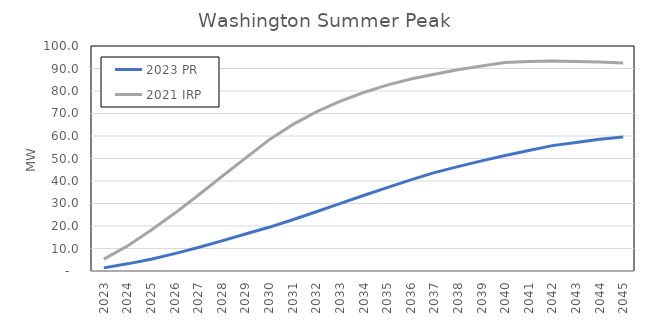
| Category | 2023 PR | 2021 IRP |
|---|---|---|
| 2023.0 | 1.398 | 5.265 |
| 2024.0 | 3.178 | 11.132 |
| 2025.0 | 5.244 | 18.14 |
| 2026.0 | 7.74 | 25.625 |
| 2027.0 | 10.474 | 33.683 |
| 2028.0 | 13.402 | 42.013 |
| 2029.0 | 16.462 | 50.157 |
| 2030.0 | 19.418 | 58.283 |
| 2031.0 | 22.79 | 65.046 |
| 2032.0 | 26.343 | 70.714 |
| 2033.0 | 29.946 | 75.423 |
| 2034.0 | 33.559 | 79.323 |
| 2035.0 | 37.083 | 82.589 |
| 2036.0 | 40.496 | 85.349 |
| 2037.0 | 43.707 | 87.468 |
| 2038.0 | 46.396 | 89.411 |
| 2039.0 | 48.947 | 91.103 |
| 2040.0 | 51.308 | 92.646 |
| 2041.0 | 53.551 | 93.117 |
| 2042.0 | 55.728 | 93.31 |
| 2043.0 | 57.098 | 93.157 |
| 2044.0 | 58.52 | 92.836 |
| 2045.0 | 59.55 | 92.493 |